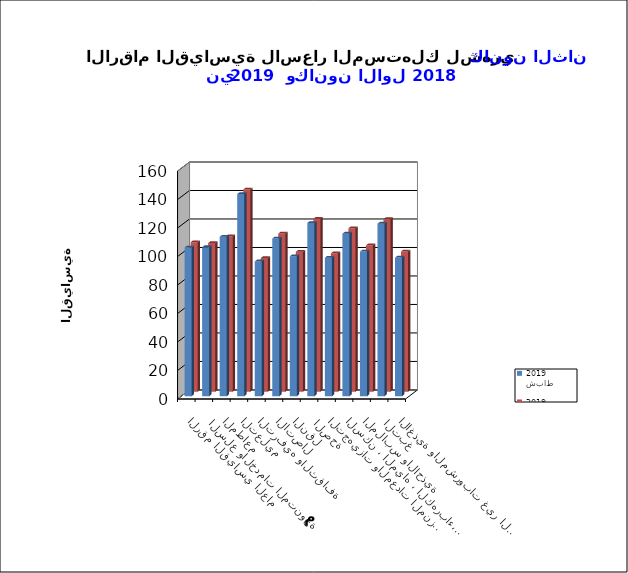
| Category | شباط   2019      | كانون الثاني 2019      |
|---|---|---|
| الاغذية والمشروبات غير الكحولية | 97.3 | 98.4 |
|  التبغ | 121.1 | 121.1 |
| الملابس والاحذية | 101.5 | 102.7 |
| السكن ، المياه ، الكهرباء، الغاز  | 114.1 | 114.7 |
| التجهيزات والمعدات المنزلية والصيانة | 97.2 | 97.1 |
|  الصحة | 121.6 | 121.3 |
| النقل | 98.2 | 98.2 |
| الاتصال | 110.7 | 111 |
| الترفيه والثقافة | 94.6 | 93.8 |
| التعليم | 141.9 | 141.9 |
| المطاعم  | 111.9 | 109.1 |
|  السلع والخدمات المتنوعة | 104.6 | 104.3 |
| الرقم القياسي العام | 104.4 | 104.9 |